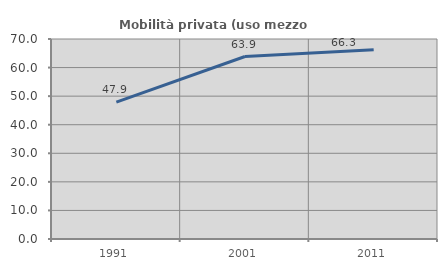
| Category | Mobilità privata (uso mezzo privato) |
|---|---|
| 1991.0 | 47.913 |
| 2001.0 | 63.867 |
| 2011.0 | 66.276 |